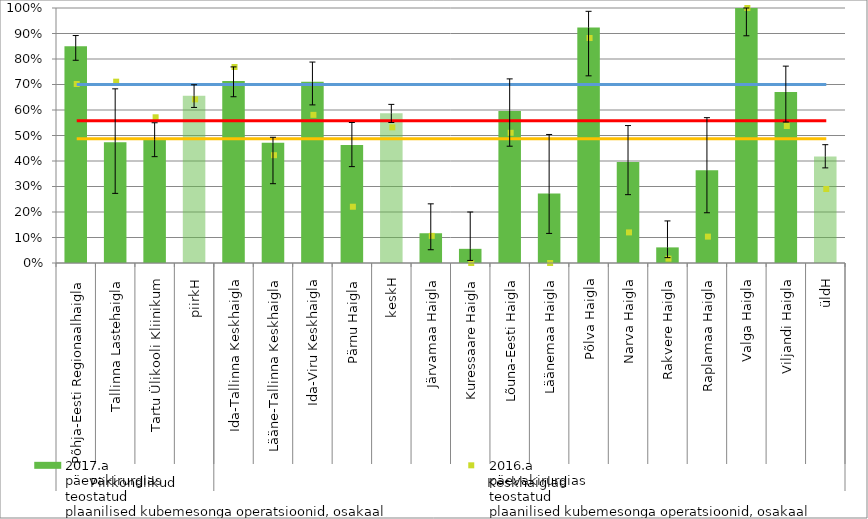
| Category | 2017.a
päevakirurgias
teostatud
plaanilised kubemesonga operatsioonid, osakaal |
|---|---|
| 0 | 0.85 |
| 1 | 0.474 |
| 2 | 0.484 |
| 3 | 0.656 |
| 4 | 0.714 |
| 5 | 0.472 |
| 6 | 0.711 |
| 7 | 0.463 |
| 8 | 0.587 |
| 9 | 0.117 |
| 10 | 0.056 |
| 11 | 0.596 |
| 12 | 0.273 |
| 13 | 0.923 |
| 14 | 0.396 |
| 15 | 0.061 |
| 16 | 0.364 |
| 17 | 1 |
| 18 | 0.671 |
| 19 | 0.418 |